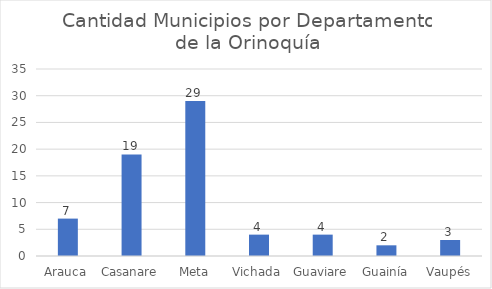
| Category | Cantidad Municipios |
|---|---|
| Arauca | 7 |
| Casanare | 19 |
| Meta | 29 |
| Vichada | 4 |
| Guaviare | 4 |
| Guainía | 2 |
| Vaupés | 3 |